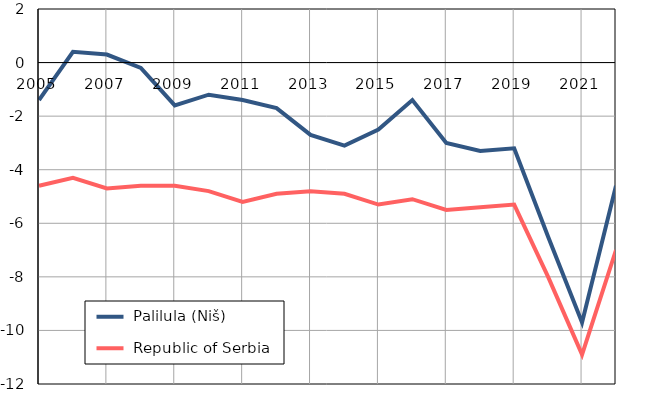
| Category |  Palilula (Niš) |  Republic of Serbia |
|---|---|---|
| 2005.0 | -1.4 | -4.6 |
| 2006.0 | 0.4 | -4.3 |
| 2007.0 | 0.3 | -4.7 |
| 2008.0 | -0.2 | -4.6 |
| 2009.0 | -1.6 | -4.6 |
| 2010.0 | -1.2 | -4.8 |
| 2011.0 | -1.4 | -5.2 |
| 2012.0 | -1.7 | -4.9 |
| 2013.0 | -2.7 | -4.8 |
| 2014.0 | -3.1 | -4.9 |
| 2015.0 | -2.5 | -5.3 |
| 2016.0 | -1.4 | -5.1 |
| 2017.0 | -3 | -5.5 |
| 2018.0 | -3.3 | -5.4 |
| 2019.0 | -3.2 | -5.3 |
| 2020.0 | -6.5 | -8 |
| 2021.0 | -9.7 | -10.9 |
| 2022.0 | -4.6 | -7 |